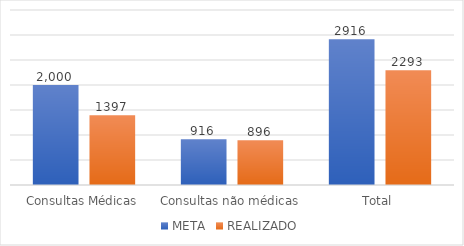
| Category | META | REALIZADO |
|---|---|---|
| Consultas Médicas | 2000 | 1397 |
| Consultas não médicas | 916 | 896 |
| Total | 2916 | 2293 |